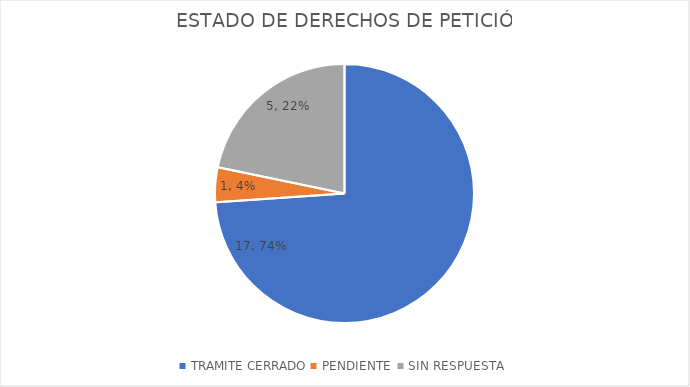
| Category | Series 0 |
|---|---|
| TRAMITE CERRADO | 17 |
| PENDIENTE  | 1 |
| SIN RESPUESTA | 5 |